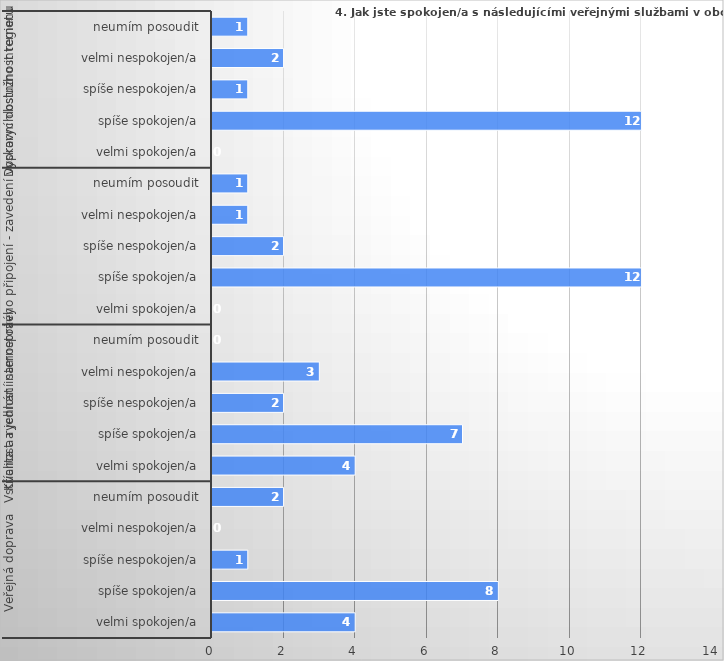
| Category | Series 0 |
|---|---|
| 0 | 4 |
| 1 | 8 |
| 2 | 1 |
| 3 | 0 |
| 4 | 2 |
| 5 | 4 |
| 6 | 7 |
| 7 | 2 |
| 8 | 3 |
| 9 | 0 |
| 10 | 0 |
| 11 | 12 |
| 12 | 2 |
| 13 | 1 |
| 14 | 1 |
| 15 | 0 |
| 16 | 12 |
| 17 | 1 |
| 18 | 2 |
| 19 | 1 |